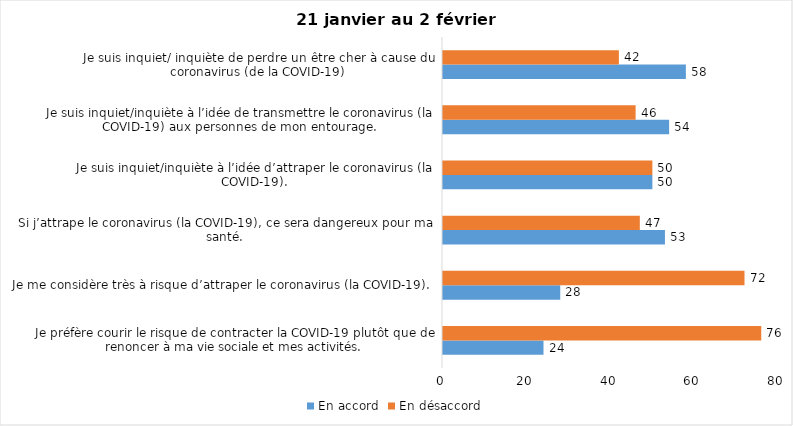
| Category | En accord | En désaccord |
|---|---|---|
| Je préfère courir le risque de contracter la COVID-19 plutôt que de renoncer à ma vie sociale et mes activités. | 24 | 76 |
| Je me considère très à risque d’attraper le coronavirus (la COVID-19). | 28 | 72 |
| Si j’attrape le coronavirus (la COVID-19), ce sera dangereux pour ma santé. | 53 | 47 |
| Je suis inquiet/inquiète à l’idée d’attraper le coronavirus (la COVID-19). | 50 | 50 |
| Je suis inquiet/inquiète à l’idée de transmettre le coronavirus (la COVID-19) aux personnes de mon entourage. | 54 | 46 |
| Je suis inquiet/ inquiète de perdre un être cher à cause du coronavirus (de la COVID-19) | 58 | 42 |